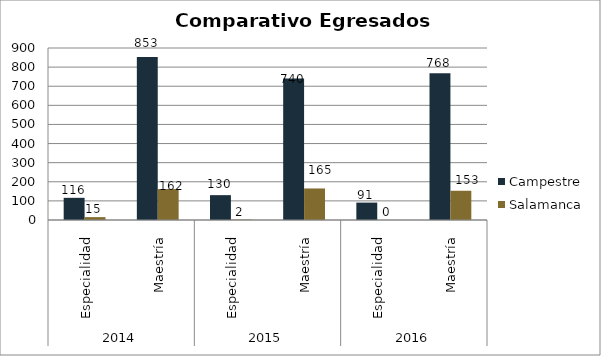
| Category | Campestre | Salamanca |
|---|---|---|
| 0 | 116 | 15 |
| 1 | 853 | 162 |
| 2 | 130 | 2 |
| 3 | 740 | 165 |
| 4 | 91 | 0 |
| 5 | 768 | 153 |